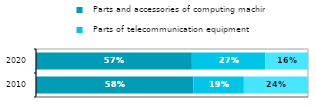
| Category |   Parts and accessories of computing machines |   Parts of telecommunication equipment |   Parts of consumer electronics |
|---|---|---|---|
| 2010 | 0.579 | 0.185 | 0.236 |
| 2020 | 0.573 | 0.27 | 0.157 |